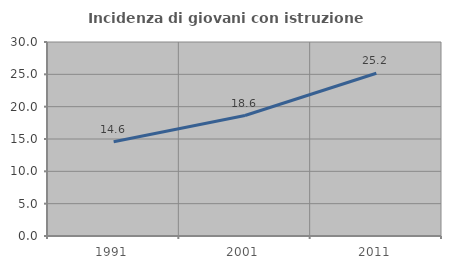
| Category | Incidenza di giovani con istruzione universitaria |
|---|---|
| 1991.0 | 14.57 |
| 2001.0 | 18.627 |
| 2011.0 | 25.175 |